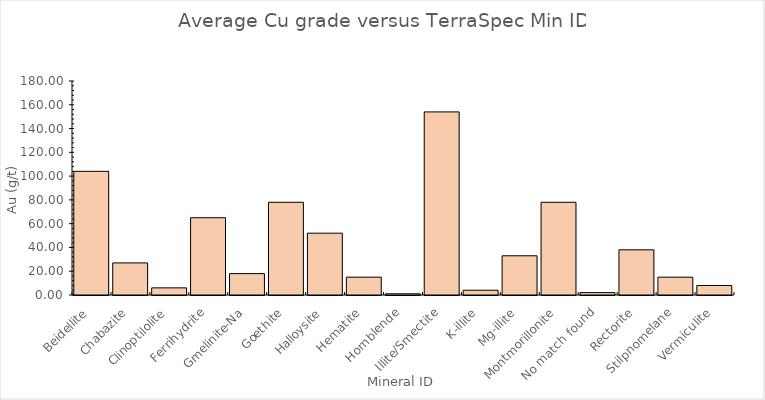
| Category | Total |
|---|---|
| Beidellite | 104 |
| Chabazite | 27 |
| Clinoptilolite | 6 |
| Ferrihydrite | 65 |
| Gmelinite-Na | 18 |
| Goethite | 78 |
| Halloysite | 52 |
| Hematite | 15 |
| Hornblende | 1 |
| Illite/Smectite | 154 |
| K-illite | 4 |
| Mg-illite | 33 |
| Montmorillonite | 78 |
| No match found | 2 |
| Rectorite | 38 |
| Stilpnomelane | 15 |
| Vermiculite | 8 |